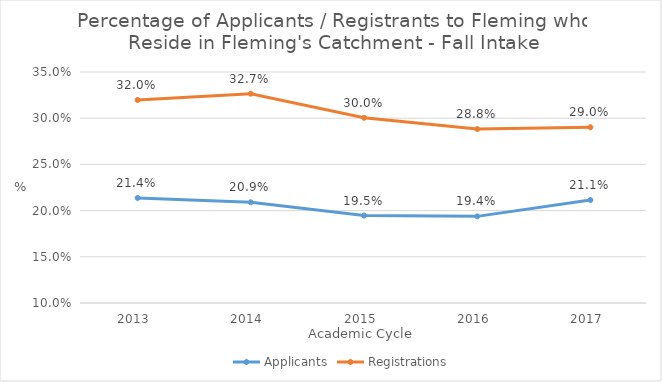
| Category | Applicants | Registrations |
|---|---|---|
| 2013  | 0.214 | 0.32 |
| 2014  | 0.209 | 0.327 |
| 2015  | 0.195 | 0.3 |
| 2016  | 0.194 | 0.288 |
| 2017  | 0.211 | 0.29 |